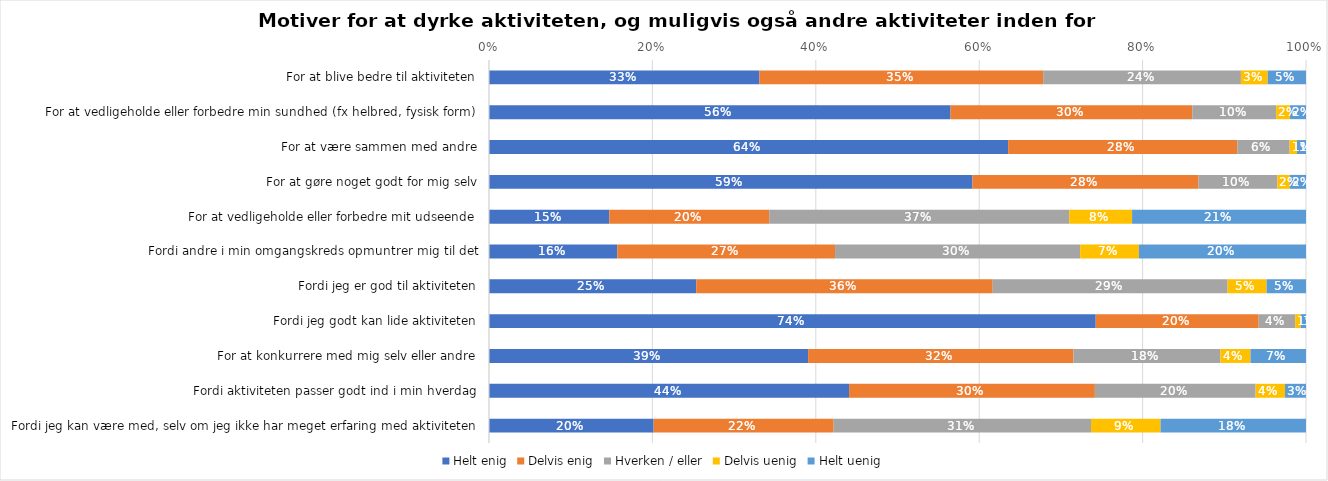
| Category | Helt enig | Delvis enig | Hverken / eller | Delvis uenig | Helt uenig |
|---|---|---|---|---|---|
| For at blive bedre til aktiviteten | 0.331 | 0.347 | 0.242 | 0.033 | 0.047 |
| For at vedligeholde eller forbedre min sundhed (fx helbred, fysisk form) | 0.565 | 0.296 | 0.103 | 0.017 | 0.02 |
| For at være sammen med andre | 0.635 | 0.28 | 0.064 | 0.009 | 0.011 |
| For at gøre noget godt for mig selv | 0.592 | 0.277 | 0.097 | 0.015 | 0.02 |
| For at vedligeholde eller forbedre mit udseende | 0.147 | 0.196 | 0.367 | 0.077 | 0.213 |
| Fordi andre i min omgangskreds opmuntrer mig til det | 0.157 | 0.267 | 0.3 | 0.072 | 0.205 |
| Fordi jeg er god til aktiviteten | 0.254 | 0.363 | 0.287 | 0.048 | 0.048 |
| Fordi jeg godt kan lide aktiviteten | 0.743 | 0.199 | 0.045 | 0.007 | 0.006 |
| For at konkurrere med mig selv eller andre | 0.391 | 0.325 | 0.18 | 0.037 | 0.068 |
| Fordi aktiviteten passer godt ind i min hverdag | 0.441 | 0.301 | 0.197 | 0.036 | 0.026 |
| Fordi jeg kan være med, selv om jeg ikke har meget erfaring med aktiviteten | 0.201 | 0.22 | 0.315 | 0.085 | 0.178 |